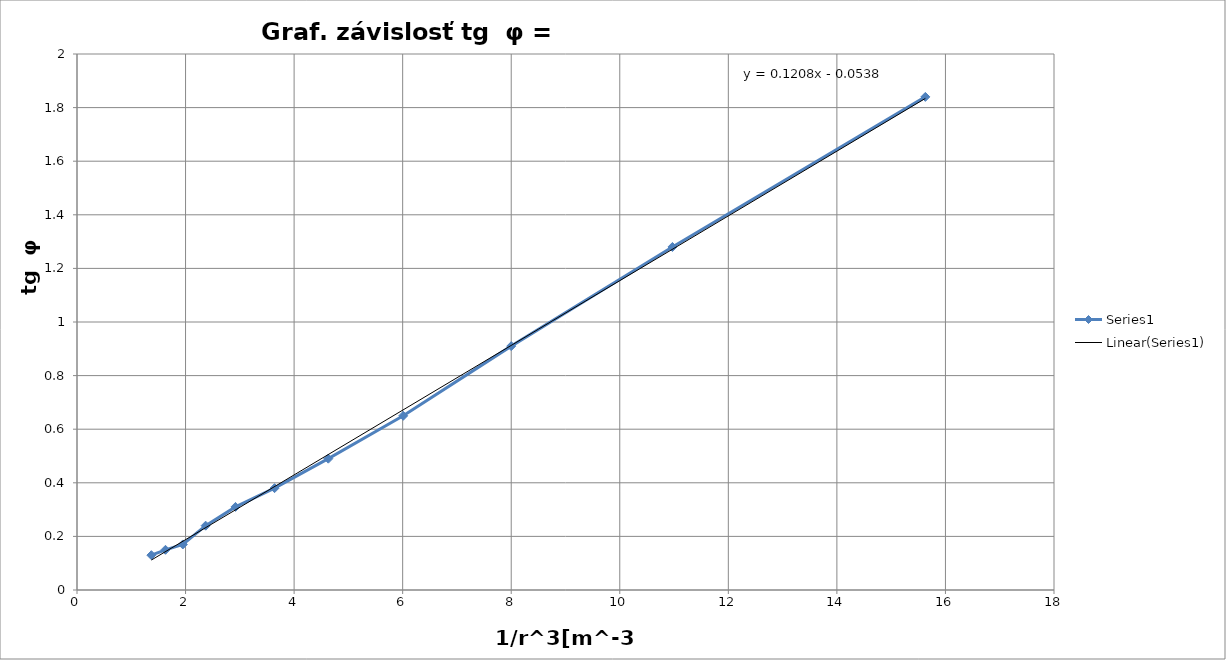
| Category | Series 0 |
|---|---|
| 1.37 | 0.13 |
| 1.63 | 0.15 |
| 1.95 | 0.17 |
| 2.37 | 0.24 |
| 2.92 | 0.31 |
| 3.64 | 0.38 |
| 4.63 | 0.49 |
| 6.01 | 0.65 |
| 8.0 | 0.91 |
| 10.97 | 1.28 |
| 15.63 | 1.84 |